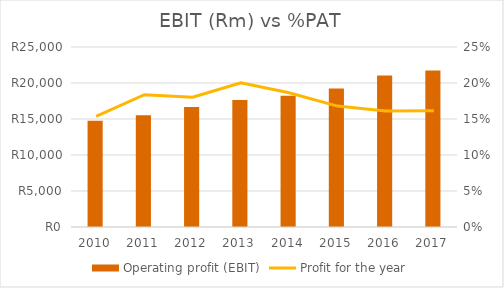
| Category | Operating profit (EBIT) |
|---|---|
| 2010.0 | 14763 |
| 2011.0 | 15522 |
| 2012.0 | 16671 |
| 2013.0 | 17640 |
| 2014.0 | 18246 |
| 2015.0 | 19235 |
| 2016.0 | 21059 |
| 2017.0 | 21750 |